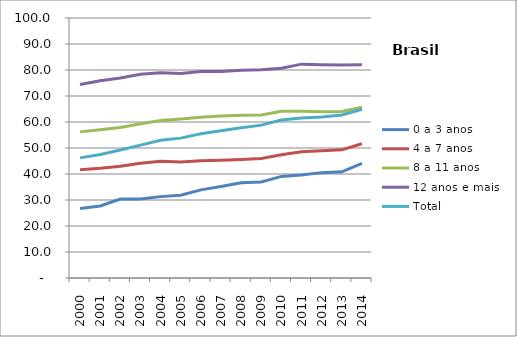
| Category | 0 a 3 anos | 4 a 7 anos | 8 a 11 anos | 12 anos e mais | Total |
|---|---|---|---|---|---|
| 2000.0 | 26.7 | 41.6 | 56.2 | 74.4 | 46.2 |
| 2001.0 | 27.7 | 42.2 | 57 | 75.9 | 47.5 |
| 2002.0 | 30.4 | 43 | 57.9 | 76.9 | 49.2 |
| 2003.0 | 30.4 | 44.1 | 59.3 | 78.4 | 51.1 |
| 2004.0 | 31.3 | 44.9 | 60.6 | 78.9 | 53 |
| 2005.0 | 31.8 | 44.6 | 61.2 | 78.7 | 53.8 |
| 2006.0 | 33.9 | 45.1 | 61.8 | 79.4 | 55.5 |
| 2007.0 | 35.2 | 45.3 | 62.3 | 79.4 | 56.6 |
| 2008.0 | 36.6 | 45.6 | 62.6 | 79.9 | 57.8 |
| 2009.0 | 36.9 | 46 | 62.7 | 80.1 | 58.8 |
| 2010.0 | 39.075 | 47.365 | 64.094 | 80.666 | 60.773 |
| 2011.0 | 39.602 | 48.539 | 64.176 | 82.256 | 61.554 |
| 2012.0 | 40.527 | 48.919 | 63.948 | 82.006 | 61.952 |
| 2013.0 | 40.84 | 49.284 | 64.048 | 81.897 | 62.679 |
| 2014.0 | 44.104 | 51.641 | 65.69 | 82.025 | 64.842 |